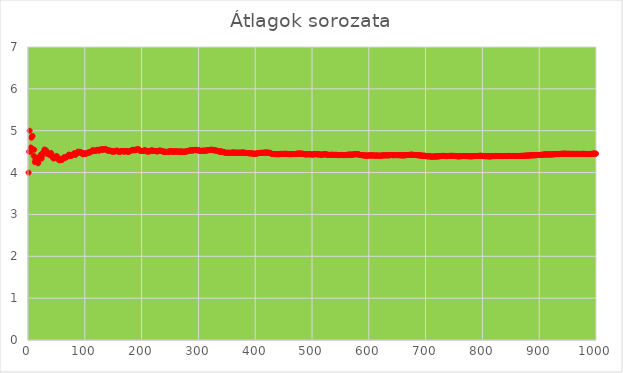
| Category | Series 0 |
|---|---|
| 1.0 | 4 |
| 2.0 | 4.5 |
| 3.0 | 5 |
| 4.0 | 4.5 |
| 5.0 | 4.6 |
| 6.0 | 4.833 |
| 7.0 | 4.857 |
| 8.0 | 4.875 |
| 9.0 | 4.556 |
| 10.0 | 4.4 |
| 11.0 | 4.545 |
| 12.0 | 4.25 |
| 13.0 | 4.308 |
| 14.0 | 4.357 |
| 15.0 | 4.333 |
| 16.0 | 4.25 |
| 17.0 | 4.235 |
| 18.0 | 4.222 |
| 19.0 | 4.316 |
| 20.0 | 4.35 |
| 21.0 | 4.381 |
| 22.0 | 4.409 |
| 23.0 | 4.435 |
| 24.0 | 4.333 |
| 25.0 | 4.4 |
| 26.0 | 4.462 |
| 27.0 | 4.481 |
| 28.0 | 4.5 |
| 29.0 | 4.552 |
| 30.0 | 4.533 |
| 31.0 | 4.516 |
| 32.0 | 4.531 |
| 33.0 | 4.485 |
| 34.0 | 4.441 |
| 35.0 | 4.457 |
| 36.0 | 4.444 |
| 37.0 | 4.432 |
| 38.0 | 4.421 |
| 39.0 | 4.462 |
| 40.0 | 4.425 |
| 41.0 | 4.463 |
| 42.0 | 4.381 |
| 43.0 | 4.372 |
| 44.0 | 4.386 |
| 45.0 | 4.333 |
| 46.0 | 4.37 |
| 47.0 | 4.362 |
| 48.0 | 4.354 |
| 49.0 | 4.388 |
| 50.0 | 4.38 |
| 51.0 | 4.392 |
| 52.0 | 4.346 |
| 53.0 | 4.321 |
| 54.0 | 4.315 |
| 55.0 | 4.291 |
| 56.0 | 4.304 |
| 57.0 | 4.298 |
| 58.0 | 4.328 |
| 59.0 | 4.305 |
| 60.0 | 4.3 |
| 61.0 | 4.328 |
| 62.0 | 4.339 |
| 63.0 | 4.365 |
| 64.0 | 4.359 |
| 65.0 | 4.354 |
| 66.0 | 4.364 |
| 67.0 | 4.358 |
| 68.0 | 4.368 |
| 69.0 | 4.391 |
| 70.0 | 4.4 |
| 71.0 | 4.408 |
| 72.0 | 4.431 |
| 73.0 | 4.411 |
| 74.0 | 4.392 |
| 75.0 | 4.4 |
| 76.0 | 4.408 |
| 77.0 | 4.403 |
| 78.0 | 4.41 |
| 79.0 | 4.43 |
| 80.0 | 4.45 |
| 81.0 | 4.457 |
| 82.0 | 4.463 |
| 83.0 | 4.422 |
| 84.0 | 4.429 |
| 85.0 | 4.447 |
| 86.0 | 4.465 |
| 87.0 | 4.483 |
| 88.0 | 4.5 |
| 89.0 | 4.494 |
| 90.0 | 4.478 |
| 91.0 | 4.495 |
| 92.0 | 4.478 |
| 93.0 | 4.495 |
| 94.0 | 4.468 |
| 95.0 | 4.463 |
| 96.0 | 4.438 |
| 97.0 | 4.443 |
| 98.0 | 4.459 |
| 99.0 | 4.455 |
| 100.0 | 4.46 |
| 101.0 | 4.446 |
| 102.0 | 4.451 |
| 103.0 | 4.456 |
| 104.0 | 4.462 |
| 105.0 | 4.476 |
| 106.0 | 4.472 |
| 107.0 | 4.477 |
| 108.0 | 4.491 |
| 109.0 | 4.477 |
| 110.0 | 4.491 |
| 111.0 | 4.495 |
| 112.0 | 4.509 |
| 113.0 | 4.522 |
| 114.0 | 4.535 |
| 115.0 | 4.522 |
| 116.0 | 4.517 |
| 117.0 | 4.521 |
| 118.0 | 4.525 |
| 119.0 | 4.521 |
| 120.0 | 4.525 |
| 121.0 | 4.537 |
| 122.0 | 4.541 |
| 123.0 | 4.545 |
| 124.0 | 4.532 |
| 125.0 | 4.52 |
| 126.0 | 4.532 |
| 127.0 | 4.543 |
| 128.0 | 4.555 |
| 129.0 | 4.55 |
| 130.0 | 4.546 |
| 131.0 | 4.557 |
| 132.0 | 4.545 |
| 133.0 | 4.549 |
| 134.0 | 4.552 |
| 135.0 | 4.563 |
| 136.0 | 4.559 |
| 137.0 | 4.562 |
| 138.0 | 4.551 |
| 139.0 | 4.532 |
| 140.0 | 4.529 |
| 141.0 | 4.525 |
| 142.0 | 4.535 |
| 143.0 | 4.524 |
| 144.0 | 4.521 |
| 145.0 | 4.517 |
| 146.0 | 4.521 |
| 147.0 | 4.51 |
| 148.0 | 4.5 |
| 149.0 | 4.503 |
| 150.0 | 4.507 |
| 151.0 | 4.51 |
| 152.0 | 4.5 |
| 153.0 | 4.503 |
| 154.0 | 4.513 |
| 155.0 | 4.516 |
| 156.0 | 4.526 |
| 157.0 | 4.522 |
| 158.0 | 4.513 |
| 159.0 | 4.497 |
| 160.0 | 4.5 |
| 161.0 | 4.503 |
| 162.0 | 4.494 |
| 163.0 | 4.503 |
| 164.0 | 4.512 |
| 165.0 | 4.515 |
| 166.0 | 4.512 |
| 167.0 | 4.515 |
| 168.0 | 4.512 |
| 169.0 | 4.497 |
| 170.0 | 4.506 |
| 171.0 | 4.515 |
| 172.0 | 4.512 |
| 173.0 | 4.509 |
| 174.0 | 4.517 |
| 175.0 | 4.503 |
| 176.0 | 4.494 |
| 177.0 | 4.497 |
| 178.0 | 4.506 |
| 179.0 | 4.508 |
| 180.0 | 4.517 |
| 181.0 | 4.525 |
| 182.0 | 4.527 |
| 183.0 | 4.536 |
| 184.0 | 4.538 |
| 185.0 | 4.546 |
| 186.0 | 4.538 |
| 187.0 | 4.529 |
| 188.0 | 4.532 |
| 189.0 | 4.54 |
| 190.0 | 4.547 |
| 191.0 | 4.55 |
| 192.0 | 4.557 |
| 193.0 | 4.549 |
| 194.0 | 4.557 |
| 195.0 | 4.554 |
| 196.0 | 4.541 |
| 197.0 | 4.523 |
| 198.0 | 4.52 |
| 199.0 | 4.523 |
| 200.0 | 4.515 |
| 201.0 | 4.517 |
| 202.0 | 4.52 |
| 203.0 | 4.517 |
| 204.0 | 4.525 |
| 205.0 | 4.527 |
| 206.0 | 4.534 |
| 207.0 | 4.531 |
| 208.0 | 4.519 |
| 209.0 | 4.507 |
| 210.0 | 4.51 |
| 211.0 | 4.502 |
| 212.0 | 4.5 |
| 213.0 | 4.507 |
| 214.0 | 4.514 |
| 215.0 | 4.512 |
| 216.0 | 4.519 |
| 217.0 | 4.525 |
| 218.0 | 4.532 |
| 219.0 | 4.525 |
| 220.0 | 4.518 |
| 221.0 | 4.52 |
| 222.0 | 4.518 |
| 223.0 | 4.516 |
| 224.0 | 4.518 |
| 225.0 | 4.511 |
| 226.0 | 4.513 |
| 227.0 | 4.507 |
| 228.0 | 4.504 |
| 229.0 | 4.511 |
| 230.0 | 4.517 |
| 231.0 | 4.524 |
| 232.0 | 4.522 |
| 233.0 | 4.528 |
| 234.0 | 4.517 |
| 235.0 | 4.515 |
| 236.0 | 4.508 |
| 237.0 | 4.511 |
| 238.0 | 4.496 |
| 239.0 | 4.498 |
| 240.0 | 4.5 |
| 241.0 | 4.498 |
| 242.0 | 4.496 |
| 243.0 | 4.494 |
| 244.0 | 4.496 |
| 245.0 | 4.494 |
| 246.0 | 4.496 |
| 247.0 | 4.498 |
| 248.0 | 4.5 |
| 249.0 | 4.502 |
| 250.0 | 4.508 |
| 251.0 | 4.514 |
| 252.0 | 4.504 |
| 253.0 | 4.502 |
| 254.0 | 4.504 |
| 255.0 | 4.502 |
| 256.0 | 4.504 |
| 257.0 | 4.498 |
| 258.0 | 4.504 |
| 259.0 | 4.502 |
| 260.0 | 4.508 |
| 261.0 | 4.506 |
| 262.0 | 4.508 |
| 263.0 | 4.502 |
| 264.0 | 4.5 |
| 265.0 | 4.494 |
| 266.0 | 4.5 |
| 267.0 | 4.506 |
| 268.0 | 4.507 |
| 269.0 | 4.494 |
| 270.0 | 4.496 |
| 271.0 | 4.502 |
| 272.0 | 4.504 |
| 273.0 | 4.495 |
| 274.0 | 4.493 |
| 275.0 | 4.498 |
| 276.0 | 4.496 |
| 277.0 | 4.502 |
| 278.0 | 4.507 |
| 279.0 | 4.502 |
| 280.0 | 4.507 |
| 281.0 | 4.512 |
| 282.0 | 4.514 |
| 283.0 | 4.519 |
| 284.0 | 4.525 |
| 285.0 | 4.53 |
| 286.0 | 4.531 |
| 287.0 | 4.526 |
| 288.0 | 4.531 |
| 289.0 | 4.533 |
| 290.0 | 4.524 |
| 291.0 | 4.529 |
| 292.0 | 4.534 |
| 293.0 | 4.539 |
| 294.0 | 4.541 |
| 295.0 | 4.546 |
| 296.0 | 4.534 |
| 297.0 | 4.539 |
| 298.0 | 4.534 |
| 299.0 | 4.528 |
| 300.0 | 4.533 |
| 301.0 | 4.528 |
| 302.0 | 4.52 |
| 303.0 | 4.521 |
| 304.0 | 4.52 |
| 305.0 | 4.518 |
| 306.0 | 4.516 |
| 307.0 | 4.521 |
| 308.0 | 4.526 |
| 309.0 | 4.524 |
| 310.0 | 4.516 |
| 311.0 | 4.521 |
| 312.0 | 4.522 |
| 313.0 | 4.527 |
| 314.0 | 4.525 |
| 315.0 | 4.53 |
| 316.0 | 4.532 |
| 317.0 | 4.533 |
| 318.0 | 4.538 |
| 319.0 | 4.539 |
| 320.0 | 4.541 |
| 321.0 | 4.542 |
| 322.0 | 4.547 |
| 323.0 | 4.545 |
| 324.0 | 4.543 |
| 325.0 | 4.542 |
| 326.0 | 4.54 |
| 327.0 | 4.532 |
| 328.0 | 4.53 |
| 329.0 | 4.529 |
| 330.0 | 4.533 |
| 331.0 | 4.526 |
| 332.0 | 4.518 |
| 333.0 | 4.52 |
| 334.0 | 4.518 |
| 335.0 | 4.513 |
| 336.0 | 4.503 |
| 337.0 | 4.499 |
| 338.0 | 4.503 |
| 339.0 | 4.501 |
| 340.0 | 4.503 |
| 341.0 | 4.499 |
| 342.0 | 4.5 |
| 343.0 | 4.496 |
| 344.0 | 4.488 |
| 345.0 | 4.484 |
| 346.0 | 4.483 |
| 347.0 | 4.481 |
| 348.0 | 4.474 |
| 349.0 | 4.47 |
| 350.0 | 4.469 |
| 351.0 | 4.47 |
| 352.0 | 4.474 |
| 353.0 | 4.476 |
| 354.0 | 4.472 |
| 355.0 | 4.47 |
| 356.0 | 4.472 |
| 357.0 | 4.468 |
| 358.0 | 4.472 |
| 359.0 | 4.476 |
| 360.0 | 4.481 |
| 361.0 | 4.476 |
| 362.0 | 4.481 |
| 363.0 | 4.474 |
| 364.0 | 4.475 |
| 365.0 | 4.474 |
| 366.0 | 4.473 |
| 367.0 | 4.477 |
| 368.0 | 4.476 |
| 369.0 | 4.472 |
| 370.0 | 4.473 |
| 371.0 | 4.474 |
| 372.0 | 4.473 |
| 373.0 | 4.477 |
| 374.0 | 4.476 |
| 375.0 | 4.472 |
| 376.0 | 4.476 |
| 377.0 | 4.48 |
| 378.0 | 4.476 |
| 379.0 | 4.478 |
| 380.0 | 4.476 |
| 381.0 | 4.478 |
| 382.0 | 4.469 |
| 383.0 | 4.465 |
| 384.0 | 4.469 |
| 385.0 | 4.468 |
| 386.0 | 4.466 |
| 387.0 | 4.465 |
| 388.0 | 4.466 |
| 389.0 | 4.463 |
| 390.0 | 4.456 |
| 391.0 | 4.46 |
| 392.0 | 4.459 |
| 393.0 | 4.461 |
| 394.0 | 4.459 |
| 395.0 | 4.458 |
| 396.0 | 4.455 |
| 397.0 | 4.448 |
| 398.0 | 4.447 |
| 399.0 | 4.449 |
| 400.0 | 4.452 |
| 401.0 | 4.449 |
| 402.0 | 4.453 |
| 403.0 | 4.457 |
| 404.0 | 4.458 |
| 405.0 | 4.462 |
| 406.0 | 4.466 |
| 407.0 | 4.467 |
| 408.0 | 4.466 |
| 409.0 | 4.469 |
| 410.0 | 4.473 |
| 411.0 | 4.472 |
| 412.0 | 4.471 |
| 413.0 | 4.475 |
| 414.0 | 4.469 |
| 415.0 | 4.472 |
| 416.0 | 4.476 |
| 417.0 | 4.477 |
| 418.0 | 4.476 |
| 419.0 | 4.477 |
| 420.0 | 4.479 |
| 421.0 | 4.475 |
| 422.0 | 4.472 |
| 423.0 | 4.475 |
| 424.0 | 4.472 |
| 425.0 | 4.475 |
| 426.0 | 4.469 |
| 427.0 | 4.461 |
| 428.0 | 4.456 |
| 429.0 | 4.45 |
| 430.0 | 4.444 |
| 431.0 | 4.445 |
| 432.0 | 4.44 |
| 433.0 | 4.441 |
| 434.0 | 4.442 |
| 435.0 | 4.444 |
| 436.0 | 4.443 |
| 437.0 | 4.437 |
| 438.0 | 4.436 |
| 439.0 | 4.44 |
| 440.0 | 4.443 |
| 441.0 | 4.442 |
| 442.0 | 4.437 |
| 443.0 | 4.44 |
| 444.0 | 4.444 |
| 445.0 | 4.447 |
| 446.0 | 4.444 |
| 447.0 | 4.447 |
| 448.0 | 4.444 |
| 449.0 | 4.445 |
| 450.0 | 4.444 |
| 451.0 | 4.446 |
| 452.0 | 4.449 |
| 453.0 | 4.448 |
| 454.0 | 4.449 |
| 455.0 | 4.446 |
| 456.0 | 4.447 |
| 457.0 | 4.44 |
| 458.0 | 4.443 |
| 459.0 | 4.44 |
| 460.0 | 4.443 |
| 461.0 | 4.438 |
| 462.0 | 4.437 |
| 463.0 | 4.441 |
| 464.0 | 4.44 |
| 465.0 | 4.443 |
| 466.0 | 4.442 |
| 467.0 | 4.441 |
| 468.0 | 4.442 |
| 469.0 | 4.443 |
| 470.0 | 4.443 |
| 471.0 | 4.444 |
| 472.0 | 4.447 |
| 473.0 | 4.45 |
| 474.0 | 4.451 |
| 475.0 | 4.453 |
| 476.0 | 4.454 |
| 477.0 | 4.451 |
| 478.0 | 4.452 |
| 479.0 | 4.455 |
| 480.0 | 4.454 |
| 481.0 | 4.447 |
| 482.0 | 4.45 |
| 483.0 | 4.451 |
| 484.0 | 4.448 |
| 485.0 | 4.445 |
| 486.0 | 4.442 |
| 487.0 | 4.435 |
| 488.0 | 4.434 |
| 489.0 | 4.436 |
| 490.0 | 4.435 |
| 491.0 | 4.436 |
| 492.0 | 4.437 |
| 493.0 | 4.44 |
| 494.0 | 4.437 |
| 495.0 | 4.436 |
| 496.0 | 4.433 |
| 497.0 | 4.437 |
| 498.0 | 4.434 |
| 499.0 | 4.435 |
| 500.0 | 4.432 |
| 501.0 | 4.429 |
| 502.0 | 4.432 |
| 503.0 | 4.435 |
| 504.0 | 4.438 |
| 505.0 | 4.438 |
| 506.0 | 4.439 |
| 507.0 | 4.442 |
| 508.0 | 4.439 |
| 509.0 | 4.434 |
| 510.0 | 4.433 |
| 511.0 | 4.434 |
| 512.0 | 4.436 |
| 513.0 | 4.433 |
| 514.0 | 4.434 |
| 515.0 | 4.427 |
| 516.0 | 4.428 |
| 517.0 | 4.426 |
| 518.0 | 4.427 |
| 519.0 | 4.43 |
| 520.0 | 4.433 |
| 521.0 | 4.436 |
| 522.0 | 4.439 |
| 523.0 | 4.44 |
| 524.0 | 4.435 |
| 525.0 | 4.43 |
| 526.0 | 4.43 |
| 527.0 | 4.427 |
| 528.0 | 4.426 |
| 529.0 | 4.423 |
| 530.0 | 4.423 |
| 531.0 | 4.422 |
| 532.0 | 4.421 |
| 533.0 | 4.424 |
| 534.0 | 4.427 |
| 535.0 | 4.426 |
| 536.0 | 4.422 |
| 537.0 | 4.423 |
| 538.0 | 4.422 |
| 539.0 | 4.423 |
| 540.0 | 4.424 |
| 541.0 | 4.421 |
| 542.0 | 4.424 |
| 543.0 | 4.424 |
| 544.0 | 4.419 |
| 545.0 | 4.417 |
| 546.0 | 4.418 |
| 547.0 | 4.42 |
| 548.0 | 4.416 |
| 549.0 | 4.417 |
| 550.0 | 4.42 |
| 551.0 | 4.423 |
| 552.0 | 4.42 |
| 553.0 | 4.42 |
| 554.0 | 4.419 |
| 555.0 | 4.418 |
| 556.0 | 4.417 |
| 557.0 | 4.418 |
| 558.0 | 4.419 |
| 559.0 | 4.417 |
| 560.0 | 4.42 |
| 561.0 | 4.421 |
| 562.0 | 4.423 |
| 563.0 | 4.426 |
| 564.0 | 4.427 |
| 565.0 | 4.428 |
| 566.0 | 4.426 |
| 567.0 | 4.429 |
| 568.0 | 4.43 |
| 569.0 | 4.425 |
| 570.0 | 4.426 |
| 571.0 | 4.429 |
| 572.0 | 4.43 |
| 573.0 | 4.433 |
| 574.0 | 4.434 |
| 575.0 | 4.437 |
| 576.0 | 4.438 |
| 577.0 | 4.438 |
| 578.0 | 4.438 |
| 579.0 | 4.44 |
| 580.0 | 4.434 |
| 581.0 | 4.435 |
| 582.0 | 4.435 |
| 583.0 | 4.429 |
| 584.0 | 4.425 |
| 585.0 | 4.419 |
| 586.0 | 4.418 |
| 587.0 | 4.417 |
| 588.0 | 4.417 |
| 589.0 | 4.413 |
| 590.0 | 4.412 |
| 591.0 | 4.411 |
| 592.0 | 4.407 |
| 593.0 | 4.406 |
| 594.0 | 4.407 |
| 595.0 | 4.405 |
| 596.0 | 4.404 |
| 597.0 | 4.405 |
| 598.0 | 4.406 |
| 599.0 | 4.409 |
| 600.0 | 4.41 |
| 601.0 | 4.408 |
| 602.0 | 4.41 |
| 603.0 | 4.408 |
| 604.0 | 4.409 |
| 605.0 | 4.408 |
| 606.0 | 4.411 |
| 607.0 | 4.41 |
| 608.0 | 4.413 |
| 609.0 | 4.407 |
| 610.0 | 4.402 |
| 611.0 | 4.404 |
| 612.0 | 4.405 |
| 613.0 | 4.408 |
| 614.0 | 4.409 |
| 615.0 | 4.405 |
| 616.0 | 4.406 |
| 617.0 | 4.404 |
| 618.0 | 4.401 |
| 619.0 | 4.402 |
| 620.0 | 4.403 |
| 621.0 | 4.406 |
| 622.0 | 4.405 |
| 623.0 | 4.406 |
| 624.0 | 4.409 |
| 625.0 | 4.41 |
| 626.0 | 4.412 |
| 627.0 | 4.415 |
| 628.0 | 4.412 |
| 629.0 | 4.412 |
| 630.0 | 4.413 |
| 631.0 | 4.41 |
| 632.0 | 4.413 |
| 633.0 | 4.412 |
| 634.0 | 4.415 |
| 635.0 | 4.413 |
| 636.0 | 4.412 |
| 637.0 | 4.414 |
| 638.0 | 4.415 |
| 639.0 | 4.418 |
| 640.0 | 4.419 |
| 641.0 | 4.418 |
| 642.0 | 4.416 |
| 643.0 | 4.414 |
| 644.0 | 4.415 |
| 645.0 | 4.417 |
| 646.0 | 4.418 |
| 647.0 | 4.419 |
| 648.0 | 4.418 |
| 649.0 | 4.414 |
| 650.0 | 4.417 |
| 651.0 | 4.418 |
| 652.0 | 4.414 |
| 653.0 | 4.415 |
| 654.0 | 4.417 |
| 655.0 | 4.415 |
| 656.0 | 4.412 |
| 657.0 | 4.414 |
| 658.0 | 4.41 |
| 659.0 | 4.413 |
| 660.0 | 4.412 |
| 661.0 | 4.411 |
| 662.0 | 4.411 |
| 663.0 | 4.413 |
| 664.0 | 4.414 |
| 665.0 | 4.417 |
| 666.0 | 4.419 |
| 667.0 | 4.417 |
| 668.0 | 4.419 |
| 669.0 | 4.422 |
| 670.0 | 4.422 |
| 671.0 | 4.42 |
| 672.0 | 4.423 |
| 673.0 | 4.423 |
| 674.0 | 4.426 |
| 675.0 | 4.427 |
| 676.0 | 4.428 |
| 677.0 | 4.425 |
| 678.0 | 4.422 |
| 679.0 | 4.42 |
| 680.0 | 4.422 |
| 681.0 | 4.421 |
| 682.0 | 4.419 |
| 683.0 | 4.417 |
| 684.0 | 4.42 |
| 685.0 | 4.416 |
| 686.0 | 4.413 |
| 687.0 | 4.413 |
| 688.0 | 4.413 |
| 689.0 | 4.409 |
| 690.0 | 4.409 |
| 691.0 | 4.41 |
| 692.0 | 4.41 |
| 693.0 | 4.405 |
| 694.0 | 4.401 |
| 695.0 | 4.403 |
| 696.0 | 4.401 |
| 697.0 | 4.402 |
| 698.0 | 4.401 |
| 699.0 | 4.402 |
| 700.0 | 4.399 |
| 701.0 | 4.395 |
| 702.0 | 4.392 |
| 703.0 | 4.388 |
| 704.0 | 4.388 |
| 705.0 | 4.389 |
| 706.0 | 4.39 |
| 707.0 | 4.39 |
| 708.0 | 4.387 |
| 709.0 | 4.382 |
| 710.0 | 4.383 |
| 711.0 | 4.38 |
| 712.0 | 4.381 |
| 713.0 | 4.381 |
| 714.0 | 4.384 |
| 715.0 | 4.383 |
| 716.0 | 4.384 |
| 717.0 | 4.384 |
| 718.0 | 4.386 |
| 719.0 | 4.384 |
| 720.0 | 4.385 |
| 721.0 | 4.387 |
| 722.0 | 4.386 |
| 723.0 | 4.389 |
| 724.0 | 4.39 |
| 725.0 | 4.392 |
| 726.0 | 4.394 |
| 727.0 | 4.396 |
| 728.0 | 4.397 |
| 729.0 | 4.398 |
| 730.0 | 4.399 |
| 731.0 | 4.401 |
| 732.0 | 4.399 |
| 733.0 | 4.396 |
| 734.0 | 4.398 |
| 735.0 | 4.393 |
| 736.0 | 4.395 |
| 737.0 | 4.393 |
| 738.0 | 4.392 |
| 739.0 | 4.394 |
| 740.0 | 4.396 |
| 741.0 | 4.397 |
| 742.0 | 4.399 |
| 743.0 | 4.397 |
| 744.0 | 4.399 |
| 745.0 | 4.401 |
| 746.0 | 4.401 |
| 747.0 | 4.399 |
| 748.0 | 4.398 |
| 749.0 | 4.398 |
| 750.0 | 4.397 |
| 751.0 | 4.398 |
| 752.0 | 4.398 |
| 753.0 | 4.393 |
| 754.0 | 4.394 |
| 755.0 | 4.391 |
| 756.0 | 4.389 |
| 757.0 | 4.386 |
| 758.0 | 4.388 |
| 759.0 | 4.389 |
| 760.0 | 4.391 |
| 761.0 | 4.393 |
| 762.0 | 4.39 |
| 763.0 | 4.392 |
| 764.0 | 4.394 |
| 765.0 | 4.396 |
| 766.0 | 4.397 |
| 767.0 | 4.396 |
| 768.0 | 4.396 |
| 769.0 | 4.393 |
| 770.0 | 4.395 |
| 771.0 | 4.394 |
| 772.0 | 4.392 |
| 773.0 | 4.391 |
| 774.0 | 4.393 |
| 775.0 | 4.391 |
| 776.0 | 4.393 |
| 777.0 | 4.391 |
| 778.0 | 4.388 |
| 779.0 | 4.39 |
| 780.0 | 4.388 |
| 781.0 | 4.388 |
| 782.0 | 4.39 |
| 783.0 | 4.391 |
| 784.0 | 4.393 |
| 785.0 | 4.392 |
| 786.0 | 4.393 |
| 787.0 | 4.395 |
| 788.0 | 4.396 |
| 789.0 | 4.395 |
| 790.0 | 4.396 |
| 791.0 | 4.394 |
| 792.0 | 4.396 |
| 793.0 | 4.397 |
| 794.0 | 4.399 |
| 795.0 | 4.401 |
| 796.0 | 4.401 |
| 797.0 | 4.402 |
| 798.0 | 4.401 |
| 799.0 | 4.397 |
| 800.0 | 4.399 |
| 801.0 | 4.396 |
| 802.0 | 4.395 |
| 803.0 | 4.395 |
| 804.0 | 4.393 |
| 805.0 | 4.391 |
| 806.0 | 4.39 |
| 807.0 | 4.39 |
| 808.0 | 4.392 |
| 809.0 | 4.391 |
| 810.0 | 4.389 |
| 811.0 | 4.388 |
| 812.0 | 4.389 |
| 813.0 | 4.386 |
| 814.0 | 4.387 |
| 815.0 | 4.389 |
| 816.0 | 4.391 |
| 817.0 | 4.392 |
| 818.0 | 4.394 |
| 819.0 | 4.392 |
| 820.0 | 4.394 |
| 821.0 | 4.396 |
| 822.0 | 4.398 |
| 823.0 | 4.397 |
| 824.0 | 4.397 |
| 825.0 | 4.396 |
| 826.0 | 4.393 |
| 827.0 | 4.394 |
| 828.0 | 4.396 |
| 829.0 | 4.397 |
| 830.0 | 4.396 |
| 831.0 | 4.396 |
| 832.0 | 4.393 |
| 833.0 | 4.395 |
| 834.0 | 4.397 |
| 835.0 | 4.394 |
| 836.0 | 4.392 |
| 837.0 | 4.394 |
| 838.0 | 4.396 |
| 839.0 | 4.396 |
| 840.0 | 4.396 |
| 841.0 | 4.396 |
| 842.0 | 4.395 |
| 843.0 | 4.395 |
| 844.0 | 4.397 |
| 845.0 | 4.398 |
| 846.0 | 4.398 |
| 847.0 | 4.399 |
| 848.0 | 4.397 |
| 849.0 | 4.395 |
| 850.0 | 4.396 |
| 851.0 | 4.396 |
| 852.0 | 4.398 |
| 853.0 | 4.399 |
| 854.0 | 4.396 |
| 855.0 | 4.395 |
| 856.0 | 4.394 |
| 857.0 | 4.396 |
| 858.0 | 4.397 |
| 859.0 | 4.398 |
| 860.0 | 4.395 |
| 861.0 | 4.394 |
| 862.0 | 4.396 |
| 863.0 | 4.397 |
| 864.0 | 4.397 |
| 865.0 | 4.397 |
| 866.0 | 4.398 |
| 867.0 | 4.399 |
| 868.0 | 4.399 |
| 869.0 | 4.399 |
| 870.0 | 4.4 |
| 871.0 | 4.402 |
| 872.0 | 4.399 |
| 873.0 | 4.401 |
| 874.0 | 4.402 |
| 875.0 | 4.402 |
| 876.0 | 4.403 |
| 877.0 | 4.405 |
| 878.0 | 4.405 |
| 879.0 | 4.407 |
| 880.0 | 4.406 |
| 881.0 | 4.405 |
| 882.0 | 4.407 |
| 883.0 | 4.408 |
| 884.0 | 4.41 |
| 885.0 | 4.411 |
| 886.0 | 4.412 |
| 887.0 | 4.413 |
| 888.0 | 4.412 |
| 889.0 | 4.412 |
| 890.0 | 4.412 |
| 891.0 | 4.412 |
| 892.0 | 4.414 |
| 893.0 | 4.415 |
| 894.0 | 4.417 |
| 895.0 | 4.416 |
| 896.0 | 4.417 |
| 897.0 | 4.419 |
| 898.0 | 4.418 |
| 899.0 | 4.418 |
| 900.0 | 4.42 |
| 901.0 | 4.422 |
| 902.0 | 4.422 |
| 903.0 | 4.423 |
| 904.0 | 4.423 |
| 905.0 | 4.424 |
| 906.0 | 4.426 |
| 907.0 | 4.428 |
| 908.0 | 4.43 |
| 909.0 | 4.431 |
| 910.0 | 4.433 |
| 911.0 | 4.432 |
| 912.0 | 4.434 |
| 913.0 | 4.432 |
| 914.0 | 4.432 |
| 915.0 | 4.434 |
| 916.0 | 4.433 |
| 917.0 | 4.434 |
| 918.0 | 4.432 |
| 919.0 | 4.434 |
| 920.0 | 4.434 |
| 921.0 | 4.432 |
| 922.0 | 4.433 |
| 923.0 | 4.433 |
| 924.0 | 4.435 |
| 925.0 | 4.437 |
| 926.0 | 4.436 |
| 927.0 | 4.438 |
| 928.0 | 4.44 |
| 929.0 | 4.441 |
| 930.0 | 4.442 |
| 931.0 | 4.443 |
| 932.0 | 4.442 |
| 933.0 | 4.441 |
| 934.0 | 4.44 |
| 935.0 | 4.442 |
| 936.0 | 4.443 |
| 937.0 | 4.445 |
| 938.0 | 4.447 |
| 939.0 | 4.447 |
| 940.0 | 4.449 |
| 941.0 | 4.448 |
| 942.0 | 4.45 |
| 943.0 | 4.451 |
| 944.0 | 4.449 |
| 945.0 | 4.45 |
| 946.0 | 4.451 |
| 947.0 | 4.451 |
| 948.0 | 4.448 |
| 949.0 | 4.447 |
| 950.0 | 4.447 |
| 951.0 | 4.448 |
| 952.0 | 4.447 |
| 953.0 | 4.449 |
| 954.0 | 4.447 |
| 955.0 | 4.448 |
| 956.0 | 4.446 |
| 957.0 | 4.446 |
| 958.0 | 4.448 |
| 959.0 | 4.447 |
| 960.0 | 4.446 |
| 961.0 | 4.447 |
| 962.0 | 4.446 |
| 963.0 | 4.447 |
| 964.0 | 4.444 |
| 965.0 | 4.446 |
| 966.0 | 4.446 |
| 967.0 | 4.448 |
| 968.0 | 4.445 |
| 969.0 | 4.445 |
| 970.0 | 4.446 |
| 971.0 | 4.445 |
| 972.0 | 4.445 |
| 973.0 | 4.446 |
| 974.0 | 4.445 |
| 975.0 | 4.445 |
| 976.0 | 4.447 |
| 977.0 | 4.447 |
| 978.0 | 4.449 |
| 979.0 | 4.448 |
| 980.0 | 4.445 |
| 981.0 | 4.445 |
| 982.0 | 4.443 |
| 983.0 | 4.44 |
| 984.0 | 4.442 |
| 985.0 | 4.444 |
| 986.0 | 4.443 |
| 987.0 | 4.444 |
| 988.0 | 4.441 |
| 989.0 | 4.443 |
| 990.0 | 4.444 |
| 991.0 | 4.446 |
| 992.0 | 4.448 |
| 993.0 | 4.448 |
| 994.0 | 4.45 |
| 995.0 | 4.451 |
| 996.0 | 4.452 |
| 997.0 | 4.452 |
| 998.0 | 4.454 |
| 999.0 | 4.452 |
| 1000.0 | 4.452 |